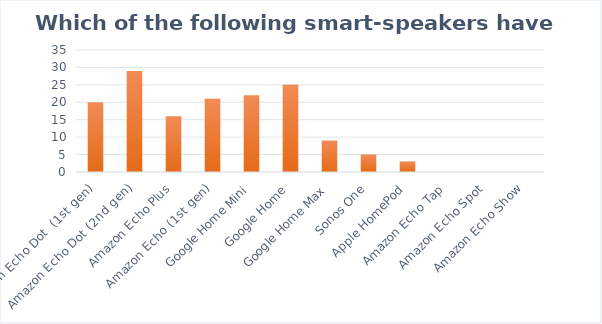
| Category | Series 0 |
|---|---|
| Amazon Echo Dot  (1st gen) | 20 |
| Amazon Echo Dot (2nd gen) | 29 |
| Amazon Echo Plus | 16 |
| Amazon Echo (1st gen) | 21 |
| Google Home Mini | 22 |
| Google Home | 25 |
| Google Home Max | 9 |
| Sonos One | 5 |
| Apple HomePod | 3 |
| Amazon Echo Tap | 0 |
| Amazon Echo Spot | 0 |
| Amazon Echo Show | 0 |